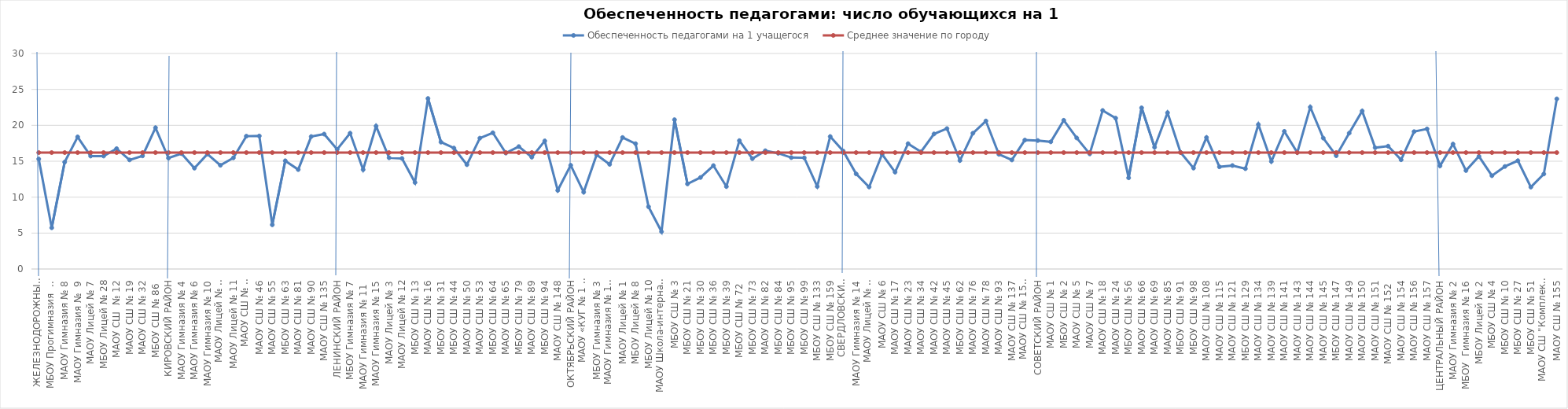
| Category | Обеспеченность педагогами на 1 учащегося | Среднее значение по городу |
|---|---|---|
| ЖЕЛЕЗНОДОРОЖНЫЙ РАЙОН | 15.312 | 16.204 |
| МБОУ Прогимназия  № 131 | 5.738 | 16.204 |
| МАОУ Гимназия № 8 | 14.888 | 16.204 |
| МАОУ Гимназия №  9 | 18.387 | 16.204 |
| МАОУ Лицей № 7 | 15.721 | 16.204 |
| МБОУ Лицей № 28 | 15.724 | 16.204 |
| МАОУ СШ  № 12 | 16.754 | 16.204 |
| МАОУ СШ № 19 | 15.184 | 16.204 |
| МАОУ СШ № 32 | 15.746 | 16.204 |
| МБОУ СШ № 86  | 19.667 | 16.204 |
| КИРОВСКИЙ РАЙОН | 15.441 | 16.204 |
| МАОУ Гимназия № 4 | 16.065 | 16.204 |
| МАОУ Гимназия № 6 | 14.038 | 16.204 |
| МАОУ Гимназия № 10 | 16 | 16.204 |
| МАОУ Лицей № 6 "Перспектива" | 14.44 | 16.204 |
| МАОУ Лицей № 11 | 15.468 | 16.204 |
| МАОУ СШ № 8 "Созидание" | 18.491 | 16.204 |
| МАОУ СШ № 46 | 18.517 | 16.204 |
| МАОУ СШ № 55 | 6.154 | 16.204 |
| МБОУ СШ № 63 | 15.066 | 16.204 |
| МАОУ СШ № 81 | 13.838 | 16.204 |
| МАОУ СШ № 90 | 18.439 | 16.204 |
| МАОУ СШ № 135 | 18.78 | 16.204 |
| ЛЕНИНСКИЙ РАЙОН | 16.646 | 16.204 |
| МБОУ Гимназия № 7 | 18.901 | 16.204 |
| МАОУ Гимназия № 11  | 13.828 | 16.204 |
| МАОУ Гимназия № 15 | 19.892 | 16.204 |
| МАОУ Лицей № 3 | 15.484 | 16.204 |
| МАОУ Лицей № 12 | 15.391 | 16.204 |
| МБОУ СШ № 13 | 12.043 | 16.204 |
| МАОУ СШ № 16 | 23.737 | 16.204 |
| МБОУ СШ № 31 | 17.658 | 16.204 |
| МБОУ СШ № 44 | 16.833 | 16.204 |
| МАОУ СШ № 50 | 14.522 | 16.204 |
| МАОУ СШ № 53 | 18.216 | 16.204 |
| МБОУ СШ № 64 | 18.963 | 16.204 |
| МАОУ СШ № 65 | 16.134 | 16.204 |
| МБОУ СШ № 79 | 17.042 | 16.204 |
| МАОУ СШ № 89 | 15.562 | 16.204 |
| МБОУ СШ № 94 | 17.826 | 16.204 |
| МАОУ СШ № 148 | 10.943 | 16.204 |
| ОКТЯБРЬСКИЙ РАЙОН | 14.436 | 16.204 |
| МАОУ «КУГ № 1 – Универс» | 10.696 | 16.204 |
| МБОУ Гимназия № 3 | 15.905 | 16.204 |
| МАОУ Гимназия № 13 "Академ" | 14.566 | 16.204 |
| МАОУ Лицей № 1 | 18.307 | 16.204 |
| МБОУ Лицей № 8 | 17.444 | 16.204 |
| МБОУ Лицей № 10 | 8.664 | 16.204 |
| МАОУ Школа-интернат № 1 | 5.2 | 16.204 |
| МБОУ СШ № 3 | 20.784 | 16.204 |
| МБОУ СШ № 21 | 11.844 | 16.204 |
| МБОУ СШ № 30 | 12.733 | 16.204 |
| МБОУ СШ № 36 | 14.395 | 16.204 |
| МБОУ СШ № 39 | 11.477 | 16.204 |
| МБОУ СШ № 72  | 17.866 | 16.204 |
| МБОУ СШ № 73 | 15.357 | 16.204 |
| МАОУ СШ № 82 | 16.462 | 16.204 |
| МБОУ СШ № 84 | 16.105 | 16.204 |
| МБОУ СШ № 95 | 15.508 | 16.204 |
| МБОУ СШ № 99 | 15.481 | 16.204 |
| МБОУ СШ № 133 | 11.485 | 16.204 |
| МБОУ СШ № 159 | 18.44 | 16.204 |
| СВЕРДЛОВСКИЙ РАЙОН | 16.424 | 16.204 |
| МАОУ Гимназия № 14 | 13.242 | 16.204 |
| МАОУ Лицей № 9 "Лидер" | 11.417 | 16.204 |
| МАОУ СШ № 6 | 15.982 | 16.204 |
| МАОУ СШ № 17 | 13.484 | 16.204 |
| МАОУ СШ № 23 | 17.45 | 16.204 |
| МАОУ СШ № 34 | 16.317 | 16.204 |
| МАОУ СШ № 42 | 18.8 | 16.204 |
| МАОУ СШ № 45 | 19.548 | 16.204 |
| МБОУ СШ № 62 | 15.1 | 16.204 |
| МАОУ СШ № 76 | 18.899 | 16.204 |
| МАОУ СШ № 78 | 20.605 | 16.204 |
| МАОУ СШ № 93 | 15.965 | 16.204 |
| МАОУ СШ № 137 | 15.176 | 16.204 |
| МАОУ СШ № 158 "Грани" | 17.948 | 16.204 |
| СОВЕТСКИЙ РАЙОН | 17.882 | 16.204 |
| МАОУ СШ № 1 | 17.702 | 16.204 |
| МБОУ СШ № 2 | 20.703 | 16.204 |
| МАОУ СШ № 5 | 18.242 | 16.204 |
| МАОУ СШ № 7 | 16.026 | 16.204 |
| МАОУ СШ № 18 | 22.068 | 16.204 |
| МАОУ СШ № 24 | 21 | 16.204 |
| МБОУ СШ № 56 | 12.69 | 16.204 |
| МАОУ СШ № 66 | 22.436 | 16.204 |
| МАОУ СШ № 69 | 16.951 | 16.204 |
| МАОУ СШ № 85 | 21.759 | 16.204 |
| МБОУ СШ № 91 | 16.241 | 16.204 |
| МБОУ СШ № 98 | 14.047 | 16.204 |
| МАОУ СШ № 108 | 18.299 | 16.204 |
| МАОУ СШ № 115 | 14.221 | 16.204 |
| МАОУ СШ № 121 | 14.403 | 16.204 |
| МБОУ СШ № 129 | 13.965 | 16.204 |
| МАОУ СШ № 134 | 20.118 | 16.204 |
| МАОУ СШ № 139 | 14.971 | 16.204 |
| МАОУ СШ № 141 | 19.164 | 16.204 |
| МАОУ СШ № 143 | 16.211 | 16.204 |
| МАОУ СШ № 144 | 22.532 | 16.204 |
| МАОУ СШ № 145 | 18.222 | 16.204 |
| МБОУ СШ № 147 | 15.767 | 16.204 |
| МАОУ СШ № 149 | 18.913 | 16.204 |
| МАОУ СШ № 150 | 21.993 | 16.204 |
| МАОУ СШ № 151 | 16.888 | 16.204 |
| МАОУ СШ № 152  | 17.103 | 16.204 |
| МАОУ СШ № 154 | 15.203 | 16.204 |
| МАОУ СШ № 156 | 19.123 | 16.204 |
| МАОУ СШ № 157 | 19.5 | 16.204 |
| ЦЕНТРАЛЬНЫЙ РАЙОН | 14.358 | 16.204 |
| МАОУ Гимназия № 2 | 17.388 | 16.204 |
| МБОУ  Гимназия № 16 | 13.704 | 16.204 |
| МБОУ Лицей № 2 | 15.679 | 16.204 |
| МБОУ СШ № 4 | 12.983 | 16.204 |
| МБОУ СШ № 10 | 14.271 | 16.204 |
| МБОУ СШ № 27 | 15.078 | 16.204 |
| МБОУ СШ № 51 | 11.4 | 16.204 |
| МАОУ СШ "Комплекс "Покровский" | 13.228 | 16.204 |
| МАОУ СШ № 155 | 23.683 | 16.204 |